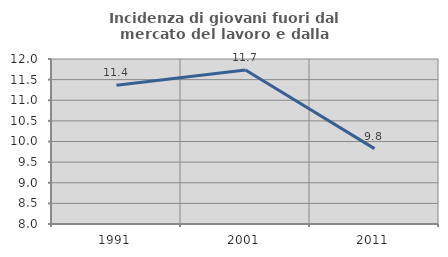
| Category | Incidenza di giovani fuori dal mercato del lavoro e dalla formazione  |
|---|---|
| 1991.0 | 11.364 |
| 2001.0 | 11.732 |
| 2011.0 | 9.827 |